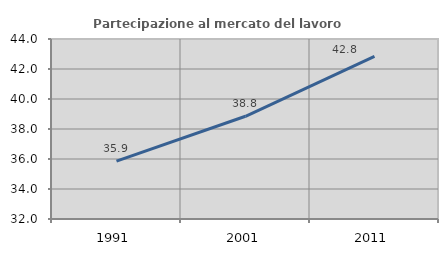
| Category | Partecipazione al mercato del lavoro  femminile |
|---|---|
| 1991.0 | 35.857 |
| 2001.0 | 38.848 |
| 2011.0 | 42.845 |